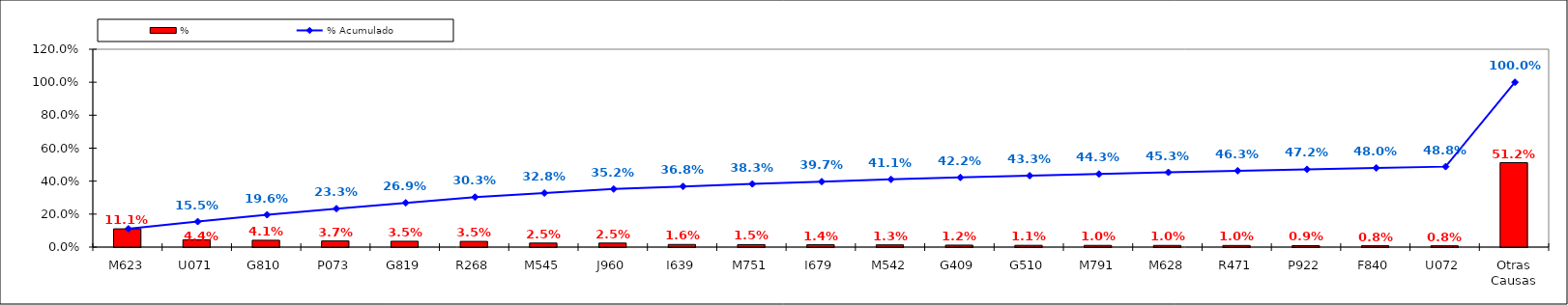
| Category | % |
|---|---|
| M623 | 0.111 |
| U071 | 0.044 |
| G810 | 0.041 |
| P073 | 0.037 |
| G819 | 0.035 |
| R268 | 0.035 |
| M545 | 0.025 |
| J960 | 0.025 |
| I639 | 0.016 |
| M751 | 0.015 |
| I679 | 0.014 |
| M542 | 0.013 |
| G409 | 0.012 |
| G510 | 0.011 |
| M791 | 0.01 |
| M628 | 0.01 |
| R471 | 0.01 |
| P922 | 0.009 |
| F840 | 0.008 |
| U072 | 0.008 |
| Otras Causas | 0.512 |